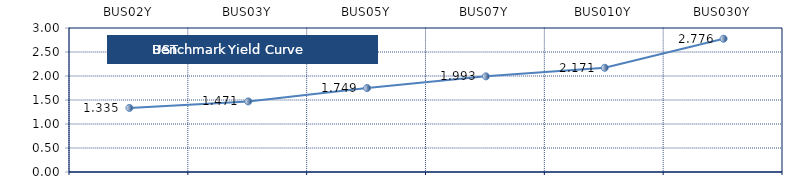
| Category | Series 0 |
|---|---|
| BUS02Y | 1.335 |
| BUS03Y | 1.471 |
| BUS05Y | 1.749 |
| BUS07Y | 1.993 |
| BUS010Y | 2.171 |
| BUS030Y | 2.776 |